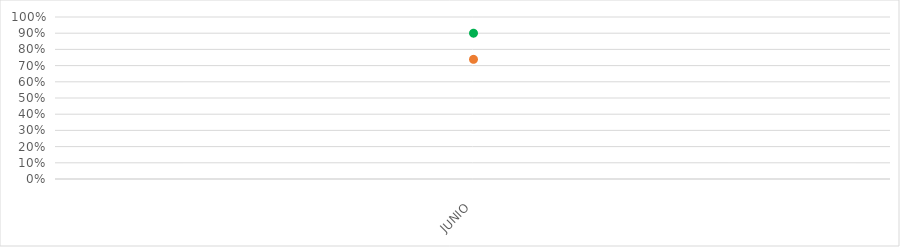
| Category | VALOR  | META PONDERADA |
|---|---|---|
| JUNIO | 0.739 | 0.9 |